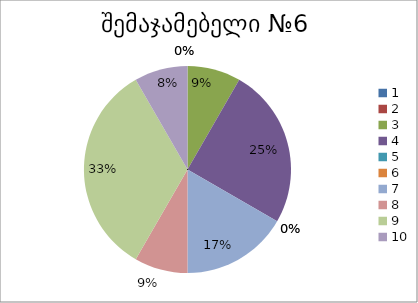
| Category | რაოდენობა | ქულა |
|---|---|---|
| 0 | 0 | 1 |
| 1 | 0 | 2 |
| 2 | 1 | 3 |
| 3 | 3 | 4 |
| 4 | 0 | 5 |
| 5 | 0 | 6 |
| 6 | 2 | 7 |
| 7 | 1 | 8 |
| 8 | 4 | 9 |
| 9 | 1 | 10 |